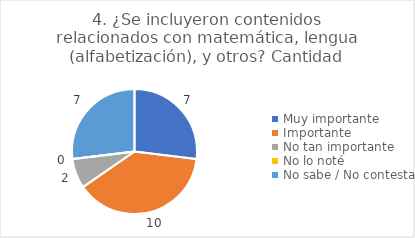
| Category | 4. ¿Se incluyeron contenidos relacionados con matemática, lengua (alfabetización), y otros? |
|---|---|
| Muy importante  | 0.269 |
| Importante  | 0.385 |
| No tan importante  | 0.077 |
| No lo noté  | 0 |
| No sabe / No contesta | 0.269 |